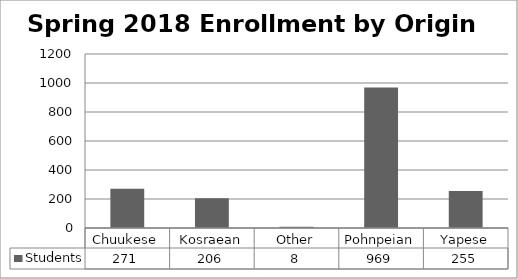
| Category | Students |
|---|---|
| Chuukese | 271 |
| Kosraean | 206 |
| Other | 8 |
| Pohnpeian | 969 |
| Yapese | 255 |